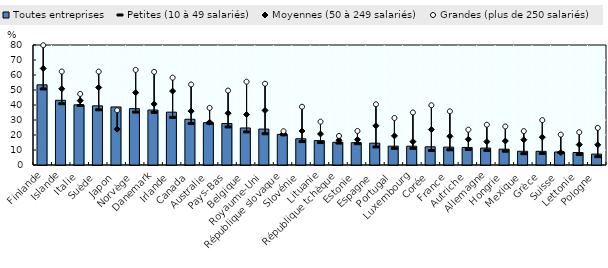
| Category | Toutes entreprises |
|---|---|
| Finlande | 53.453 |
| Islande | 43.13 |
| Italie | 40.102 |
| Suède | 39.444 |
| Japon | 38.7 |
| Norvège | 37.557 |
| Danemark | 36.647 |
| Irlande | 35.239 |
| Canada | 30.5 |
| Australie | 28.178 |
| Pays-Bas | 27.655 |
| Belgique | 24.691 |
| Royaume-Uni | 23.966 |
| République slovaque | 20.41 |
| Slovénie | 17.494 |
| Lituanie | 16.243 |
| République tchèque | 15.133 |
| Estonie | 14.852 |
| Espagne | 14.56 |
| Portugal | 12.559 |
| Luxembourg | 12.518 |
| Corée | 12.13 |
| France | 11.906 |
| Autriche | 11.669 |
| Allemagne | 11.29 |
| Hongrie | 10.56 |
| Mexique | 9.148 |
| Grèce | 9.128 |
| Suisse | 8.646 |
| Lettonie | 8.312 |
| Pologne | 7.279 |